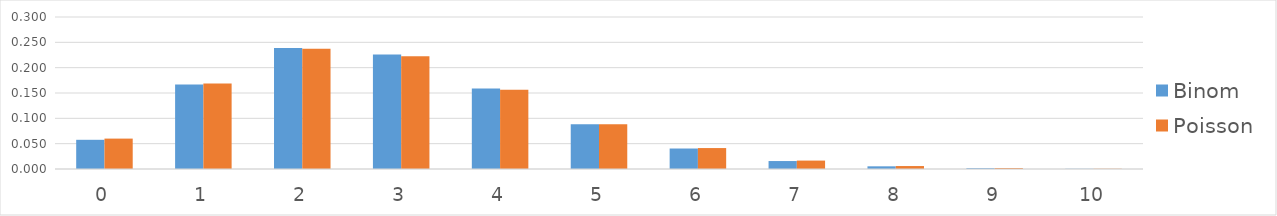
| Category | Binom | Poisson |
|---|---|---|
| 0.0 | 0.058 | 0.06 |
| 1.0 | 0.167 | 0.169 |
| 2.0 | 0.239 | 0.237 |
| 3.0 | 0.226 | 0.223 |
| 4.0 | 0.159 | 0.157 |
| 5.0 | 0.088 | 0.088 |
| 6.0 | 0.04 | 0.041 |
| 7.0 | 0.016 | 0.017 |
| 8.0 | 0.005 | 0.006 |
| 9.0 | 0.002 | 0.002 |
| 10.0 | 0 | 0.001 |